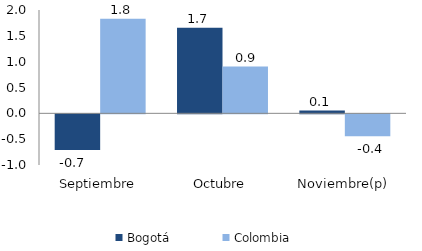
| Category | Bogotá | Colombia |
|---|---|---|
| Septiembre | -0.693 | 1.829 |
| Octubre | 1.657 | 0.906 |
| Noviembre(p) | 0.052 | -0.426 |